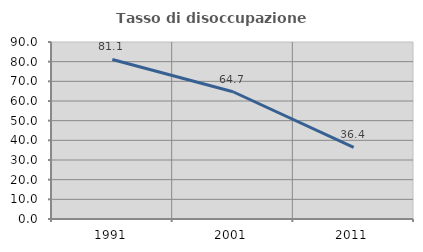
| Category | Tasso di disoccupazione giovanile  |
|---|---|
| 1991.0 | 81.111 |
| 2001.0 | 64.706 |
| 2011.0 | 36.364 |